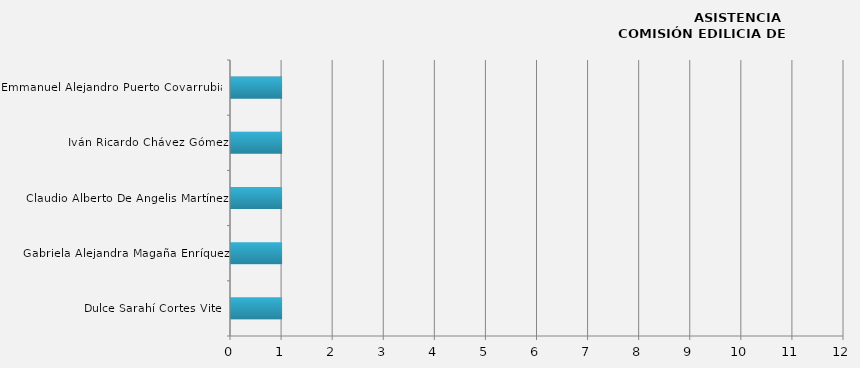
| Category | Series 0 |
|---|---|
| Dulce Sarahí Cortes Vite  | 1 |
| Gabriela Alejandra Magaña Enríquez | 1 |
| Claudio Alberto De Angelis Martínez | 1 |
| Iván Ricardo Chávez Gómez | 1 |
| Emmanuel Alejandro Puerto Covarrubias | 1 |